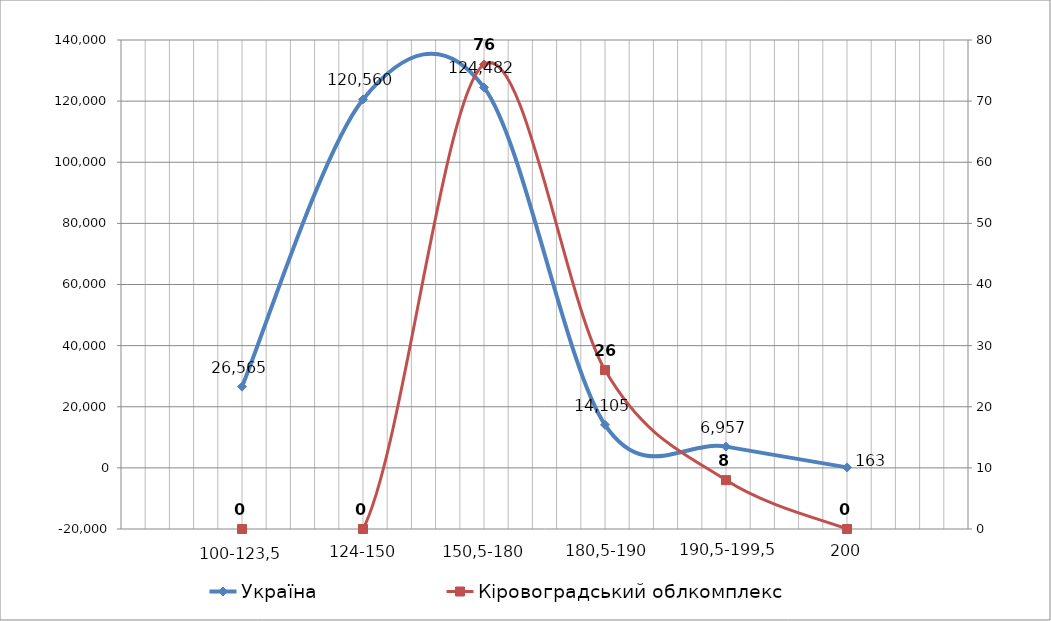
| Category | Україна |
|---|---|
| 0 | 26565 |
| 1 | 120560 |
| 2 | 124482 |
| 3 | 14105 |
| 4 | 6957 |
| 5 | 163 |